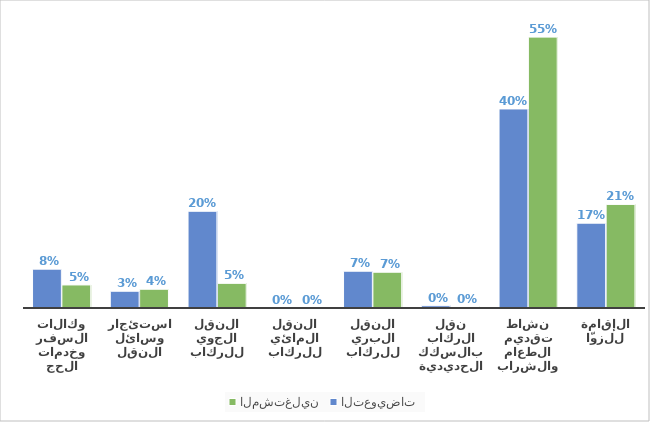
| Category | المشتغلين | التعويضات |
|---|---|---|
| الإقامة للزوّار | 0.209 | 0.171 |
| نشاط تقديم الطعام والشراب | 0.547 | 0.402 |
| نقل الركاب بالسكك الحديدية | 0.003 | 0.005 |
| النقل البري للركاب | 0.072 | 0.074 |
| النقل المائي للركاب | 0.001 | 0 |
| النقل الجوي للركاب | 0.05 | 0.195 |
| استئجار وسائل النقل | 0.038 | 0.034 |
| وكالات السفر وخدمات الحجز | 0.047 | 0.078 |